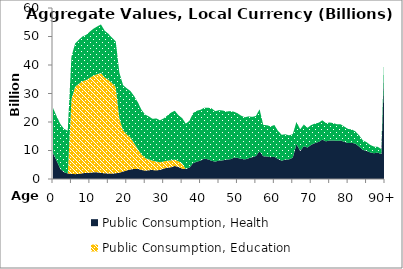
| Category | Public Consumption, Health | Public Consumption, Education | Public Consumption, Other than health and education |
|---|---|---|---|
| 0 | 9147.146 | 0 | 15764.592 |
|  | 6385.825 | 0 | 15600.686 |
| 2 | 3504.201 | 0 | 15796.994 |
| 3 | 2394.184 | 0 | 15178.629 |
| 4 | 1921.406 | 0 | 14998.769 |
| 5 | 1818.423 | 26108.986 | 15039.878 |
| 6 | 1701.352 | 30673.679 | 15147.878 |
| 7 | 1760.908 | 31628.158 | 15477.897 |
| 8 | 2030.554 | 32236.941 | 15734.792 |
| 9 | 2133.294 | 32582.905 | 15872.092 |
| 10 | 2224.043 | 33305.029 | 16204.069 |
| 11 | 2357.462 | 33922.675 | 16484.465 |
| 12 | 2337.153 | 34438.612 | 16750.487 |
| 13 | 2152.805 | 35030.481 | 17051.362 |
| 14 | 1992.421 | 33653.698 | 16406.231 |
| 15 | 1961.53 | 32859.396 | 16142.325 |
| 16 | 1917.819 | 31710.072 | 15956.04 |
| 17 | 2018.392 | 30269.003 | 16032.409 |
| 18 | 2214.767 | 18957.695 | 16125.905 |
| 19 | 2621.151 | 14451.734 | 15856.642 |
| 20 | 3004.753 | 12654.962 | 16164.196 |
| 21 | 3370.128 | 11163.282 | 16331.344 |
| 22 | 3510.459 | 9063.144 | 16521.962 |
| 23 | 3574.239 | 6858.791 | 16491.586 |
| 24 | 3183.989 | 5398.61 | 15702.218 |
| 25 | 2941.226 | 4382.19 | 15247.815 |
| 26 | 3103.954 | 3792.853 | 15052.047 |
| 27 | 3137.249 | 3288.954 | 14677.001 |
| 28 | 3034.905 | 3095.996 | 15127.697 |
| 29 | 3173.304 | 2706.31 | 14710.423 |
| 30 | 3660.699 | 2494.143 | 15100.677 |
| 31 | 3974.212 | 2439.397 | 15859.336 |
| 32 | 4118.186 | 2419.143 | 16779.897 |
| 33 | 4589.504 | 2232.89 | 17126.151 |
| 34 | 4223.803 | 2007.238 | 16181.472 |
| 35 | 3642.135 | 1833.652 | 15898.448 |
| 36 | 3467.297 | 0 | 15957.611 |
| 37 | 4019.72 | 0 | 16432.857 |
| 38 | 5585.049 | 0 | 17577.441 |
| 39 | 6079.634 | 0 | 17865.865 |
| 40 | 6463.335 | 0 | 17824.646 |
| 41 | 7133.118 | 0 | 17893.523 |
| 42 | 6932.978 | 0 | 18087.923 |
| 43 | 6366.251 | 0 | 18419.665 |
| 44 | 6119 | 0 | 17678.571 |
| 45 | 6475.024 | 0 | 17695.839 |
| 46 | 6540.479 | 0 | 17497.58 |
| 47 | 6839.17 | 0 | 16827.435 |
| 48 | 6920.545 | 0 | 16906.628 |
| 49 | 7449.07 | 0 | 16182.715 |
| 50 | 7429.079 | 0 | 15659.416 |
| 51 | 7082.28 | 0 | 15151.628 |
| 52 | 6888.909 | 0 | 14766.607 |
| 53 | 7261.03 | 0 | 14720.379 |
| 54 | 7637.486 | 0 | 14160.549 |
| 55 | 8074.187 | 0 | 14038.166 |
| 56 | 9748.472 | 0 | 14715.94 |
| 57 | 7975.849 | 0 | 10993.528 |
| 58 | 7914.558 | 0 | 10953.662 |
| 59 | 7654.565 | 0 | 10780.832 |
| 60 | 7814.717 | 0 | 11137.793 |
| 61 | 7034.686 | 0 | 9828.195 |
| 62 | 6407.122 | 0 | 9117.535 |
| 63 | 6842.409 | 0 | 8858.587 |
| 64 | 6891.152 | 0 | 8414.895 |
| 65 | 7502.165 | 0 | 8241.427 |
| 66 | 12274.344 | 0 | 7751.999 |
| 67 | 9841.622 | 0 | 7593.575 |
| 68 | 11522.066 | 0 | 7582.192 |
| 69 | 11029.981 | 0 | 6937.069 |
| 70 | 12003.058 | 0 | 6924.576 |
| 71 | 12624.013 | 0 | 6823.204 |
| 72 | 13003.178 | 0 | 6733.113 |
| 73 | 13811.282 | 0 | 6792.672 |
| 74 | 13228.086 | 0 | 6379.499 |
| 75 | 13520.823 | 0 | 6309.594 |
| 76 | 13530.164 | 0 | 6090.262 |
| 77 | 13378.902 | 0 | 5796.587 |
| 78 | 13491.696 | 0 | 5674.173 |
| 79 | 13033.861 | 0 | 5332.271 |
| 80 | 12615.208 | 0 | 4940.07 |
| 81 | 12712.251 | 0 | 4680.098 |
| 82 | 12367.518 | 0 | 4313.076 |
| 83 | 11380.905 | 0 | 3941.608 |
| 84 | 10226.632 | 0 | 3308.286 |
| 85 | 9858.907 | 0 | 3074.662 |
| 86 | 9334.004 | 0 | 2627.392 |
| 87 | 9046.726 | 0 | 2318.235 |
| 88 | 9258.41 | 0 | 2057.618 |
| 89 | 8751.646 | 0 | 1750.842 |
| 90+ | 45355.433 | 0 | 6612.541 |